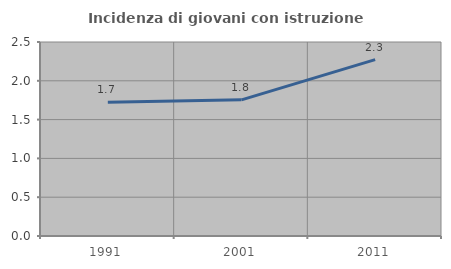
| Category | Incidenza di giovani con istruzione universitaria |
|---|---|
| 1991.0 | 1.724 |
| 2001.0 | 1.754 |
| 2011.0 | 2.273 |